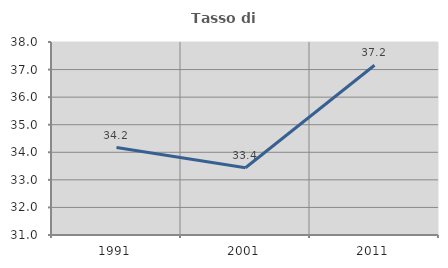
| Category | Tasso di occupazione   |
|---|---|
| 1991.0 | 34.172 |
| 2001.0 | 33.438 |
| 2011.0 | 37.157 |